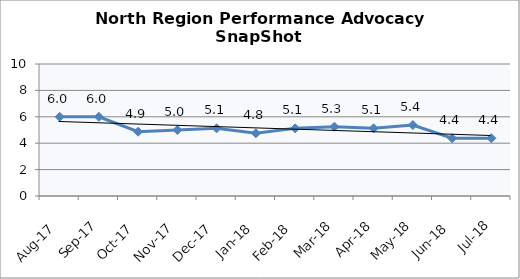
| Category | North Region |
|---|---|
| Aug-17 | 6 |
| Sep-17 | 6 |
| Oct-17 | 4.875 |
| Nov-17 | 5 |
| Dec-17 | 5.125 |
| Jan-18 | 4.75 |
| Feb-18 | 5.125 |
| Mar-18 | 5.25 |
| Apr-18 | 5.125 |
| May-18 | 5.375 |
| Jun-18 | 4.375 |
| Jul-18 | 4.375 |